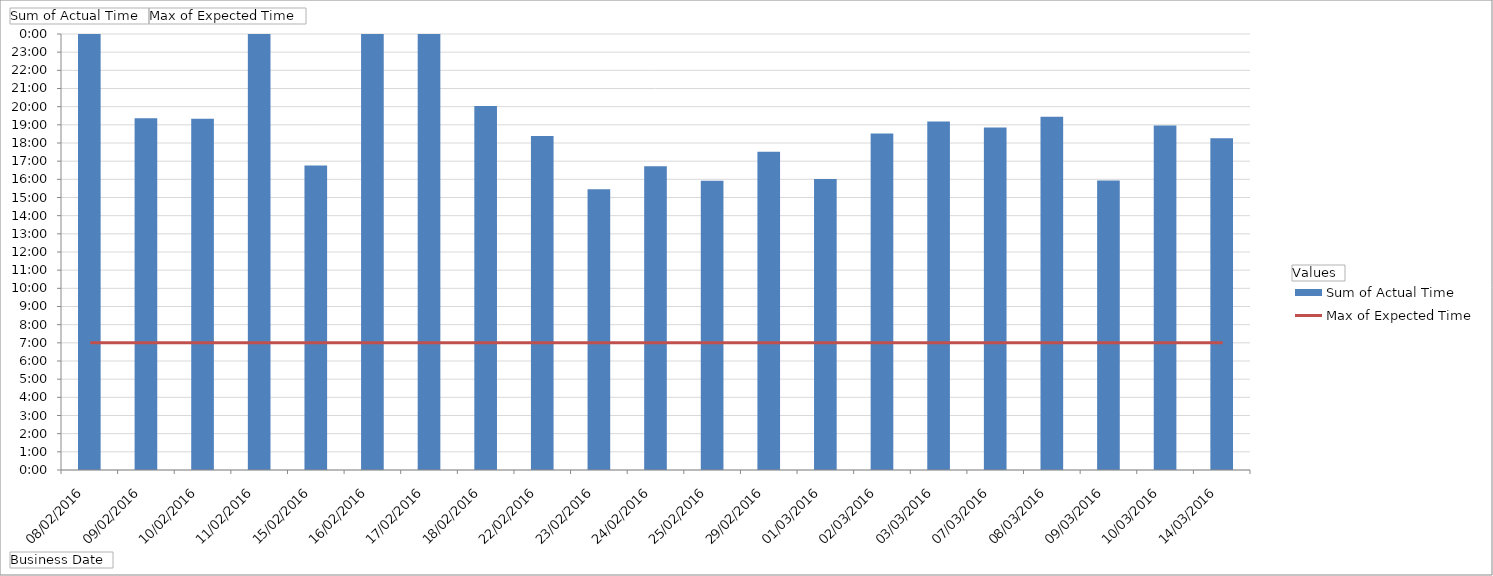
| Category | Sum of Actual Time |
|---|---|
| 08/02/2016 | 1900-01-01 15:53:43 |
| 09/02/2016 | 0.807 |
| 10/02/2016 | 0.806 |
| 11/02/2016 | 1900-01-01 20:42:40 |
| 15/02/2016 | 0.699 |
| 16/02/2016 | 1900-01-01 03:24:00 |
| 17/02/2016 | 1900-01-01 16:39:00 |
| 18/02/2016 | 0.835 |
| 22/02/2016 | 0.766 |
| 23/02/2016 | 0.644 |
| 24/02/2016 | 0.697 |
| 25/02/2016 | 0.663 |
| 29/02/2016 | 0.73 |
| 01/03/2016 | 0.667 |
| 02/03/2016 | 0.772 |
| 03/03/2016 | 0.799 |
| 07/03/2016 | 0.786 |
| 08/03/2016 | 0.81 |
| 09/03/2016 | 0.664 |
| 10/03/2016 | 0.79 |
| 14/03/2016 | 0.761 |